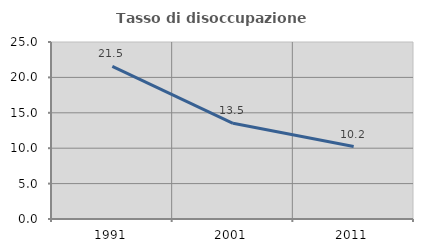
| Category | Tasso di disoccupazione giovanile  |
|---|---|
| 1991.0 | 21.547 |
| 2001.0 | 13.514 |
| 2011.0 | 10.227 |